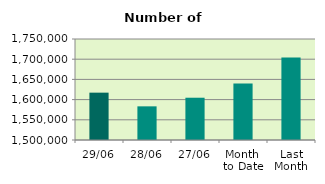
| Category | Series 0 |
|---|---|
| 29/06 | 1617190 |
| 28/06 | 1583300 |
| 27/06 | 1604646 |
| Month 
to Date | 1639707.524 |
| Last
Month | 1704183.545 |